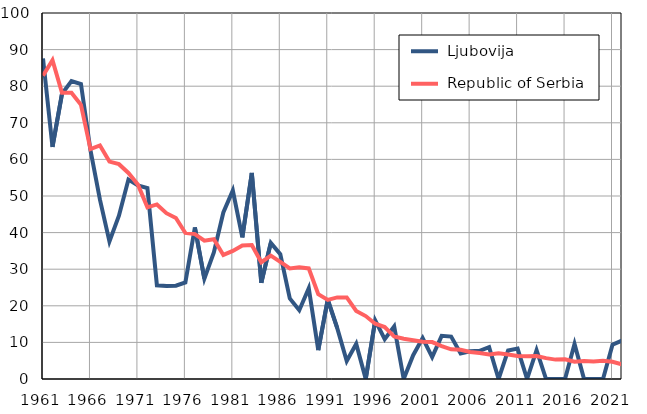
| Category |  Ljubovija |  Republic of Serbia |
|---|---|---|
| 1961.0 | 87.6 | 82.9 |
| 1962.0 | 63.4 | 87.1 |
| 1963.0 | 77.9 | 78.2 |
| 1964.0 | 81.4 | 78.2 |
| 1965.0 | 80.6 | 74.9 |
| 1966.0 | 62.5 | 62.8 |
| 1967.0 | 49 | 63.8 |
| 1968.0 | 37.6 | 59.4 |
| 1969.0 | 44.6 | 58.7 |
| 1970.0 | 54.5 | 56.3 |
| 1971.0 | 52.9 | 53.1 |
| 1972.0 | 52.2 | 46.9 |
| 1973.0 | 25.6 | 47.7 |
| 1974.0 | 25.4 | 45.3 |
| 1975.0 | 25.5 | 44 |
| 1976.0 | 26.4 | 39.9 |
| 1977.0 | 41.4 | 39.6 |
| 1978.0 | 27.4 | 37.8 |
| 1979.0 | 34.6 | 38.2 |
| 1980.0 | 45.5 | 33.9 |
| 1981.0 | 51.5 | 35 |
| 1982.0 | 38.7 | 36.5 |
| 1983.0 | 56.3 | 36.6 |
| 1984.0 | 26.3 | 31.9 |
| 1985.0 | 37.2 | 33.7 |
| 1986.0 | 34.1 | 32 |
| 1987.0 | 22 | 30.2 |
| 1988.0 | 18.8 | 30.5 |
| 1989.0 | 24.8 | 30.2 |
| 1990.0 | 7.9 | 23.2 |
| 1991.0 | 21.7 | 21.6 |
| 1992.0 | 13.9 | 22.3 |
| 1993.0 | 4.9 | 22.3 |
| 1994.0 | 9.6 | 18.6 |
| 1995.0 | 0 | 17.2 |
| 1996.0 | 16 | 15.1 |
| 1997.0 | 10.9 | 14.2 |
| 1998.0 | 14.4 | 11.6 |
| 1999.0 | 0 | 11 |
| 2000.0 | 6.5 | 10.6 |
| 2001.0 | 11.2 | 10.2 |
| 2002.0 | 6 | 10.1 |
| 2003.0 | 11.8 | 9 |
| 2004.0 | 11.6 | 8.1 |
| 2005.0 | 7 | 8 |
| 2006.0 | 7.6 | 7.4 |
| 2007.0 | 7.7 | 7.1 |
| 2008.0 | 8.7 | 6.7 |
| 2009.0 | 0 | 7 |
| 2010.0 | 7.8 | 6.7 |
| 2011.0 | 8.3 | 6.3 |
| 2012.0 | 0 | 6.2 |
| 2013.0 | 7.9 | 6.3 |
| 2014.0 | 0 | 5.7 |
| 2015.0 | 0 | 5.3 |
| 2016.0 | 0 | 5.4 |
| 2017.0 | 9.6 | 4.7 |
| 2018.0 | 0 | 4.9 |
| 2019.0 | 0 | 4.8 |
| 2020.0 | 0 | 5 |
| 2021.0 | 9.4 | 4.7 |
| 2022.0 | 10.5 | 4 |